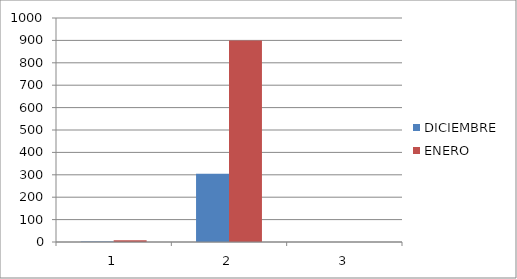
| Category | DICIEMBRE | ENERO |
|---|---|---|
| 0 | 2 | 8 |
| 1 | 305 | 899 |
| 2 | 0 | 0 |